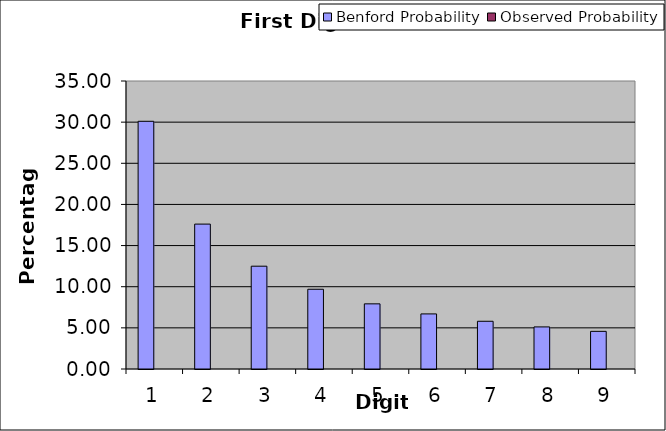
| Category | Benford Probability | Observed Probability |
|---|---|---|
| 0 | 30.103 | 0 |
| 1 | 17.609 | 0 |
| 2 | 12.494 | 0 |
| 3 | 9.691 | 0 |
| 4 | 7.918 | 0 |
| 5 | 6.695 | 0 |
| 6 | 5.799 | 0 |
| 7 | 5.115 | 0 |
| 8 | 4.576 | 0 |